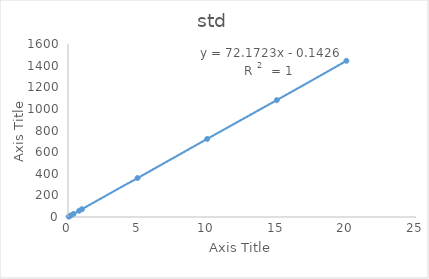
| Category | area |
|---|---|
| 0.05 | 3.54 |
| 0.1 | 7.1 |
| 0.2 | 14.2 |
| 0.4 | 28.8 |
| 0.8 | 57.6 |
| 1.0 | 72.13 |
| 5.0 | 360.63 |
| 10.0 | 722.12 |
| 15.0 | 1080.91 |
| 20.0 | 1444.2 |